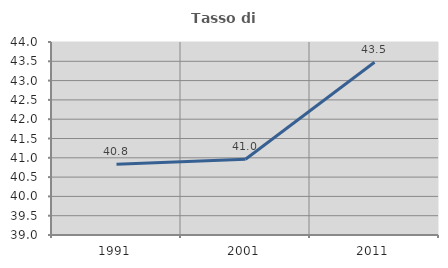
| Category | Tasso di occupazione   |
|---|---|
| 1991.0 | 40.831 |
| 2001.0 | 40.961 |
| 2011.0 | 43.474 |